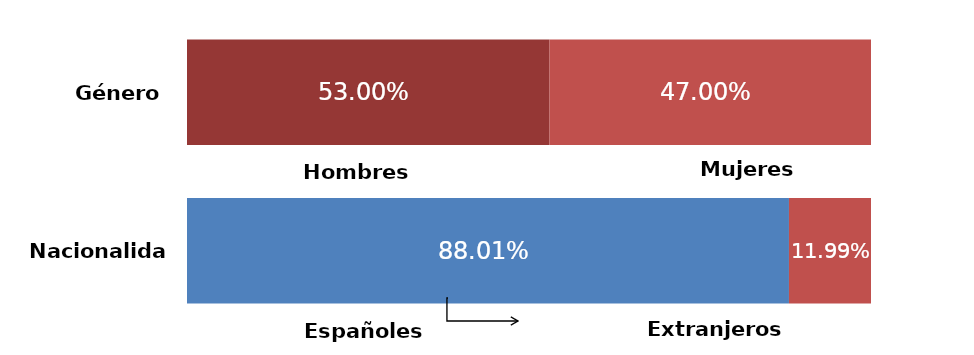
| Category | Series 0 | Series 1 |
|---|---|---|
| 0 | 0.53 | 0.47 |
| 1 | 0.88 | 0.12 |